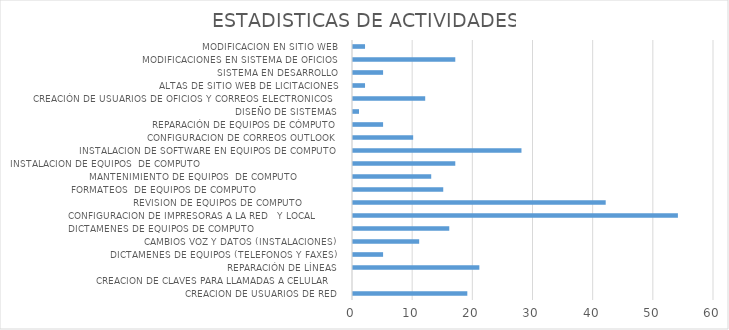
| Category | Series 0 |
|---|---|
| CREACION DE USUARIOS DE RED | 19 |
| CREACION DE CLAVES PARA LLAMADAS A CELULAR  | 0 |
| REPARACIÓN DE LÍNEAS | 21 |
| DICTAMENES DE EQUIPOS (TELEFONOS Y FAXES) | 5 |
| CAMBIOS VOZ Y DATOS (INSTALACIONES) | 11 |
| DICTAMENES DE EQUIPOS DE COMPUTO                             | 16 |
| CONFIGURACION DE IMPRESORAS A LA RED   Y LOCAL       | 54 |
| REVISION DE EQUIPOS DE COMPUTO             | 42 |
| FORMATEOS  DE EQUIPOS DE COMPUTO                            | 15 |
| MANTENIMIENTO DE EQUIPOS  DE COMPUTO               | 13 |
| INSTALACION DE EQUIPOS  DE COMPUTO                                               | 17 |
| INSTALACION DE SOFTWARE EN EQUIPOS DE COMPUTO | 28 |
| CONFIGURACION DE CORREOS OUTLOOK | 10 |
| REPARACIÓN DE EQUIPOS DE CÓMPUTO | 5 |
| DISEÑO DE SISTEMAS  | 1 |
| CREACIÓN DE USUARIOS DE OFICIOS Y CORREOS ELECTRONICOS | 12 |
| ALTAS DE SITIO WEB DE LICITACIONES | 2 |
| SISTEMA EN DESARROLLO | 5 |
| MODIFICACIONES EN SISTEMA DE OFICIOS | 17 |
| MODIFICACION EN SITIO WEB | 2 |